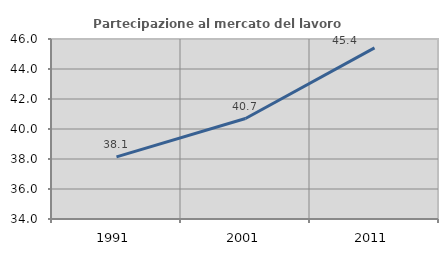
| Category | Partecipazione al mercato del lavoro  femminile |
|---|---|
| 1991.0 | 38.138 |
| 2001.0 | 40.698 |
| 2011.0 | 45.408 |